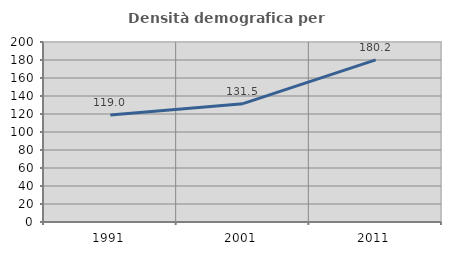
| Category | Densità demografica |
|---|---|
| 1991.0 | 118.979 |
| 2001.0 | 131.467 |
| 2011.0 | 180.204 |